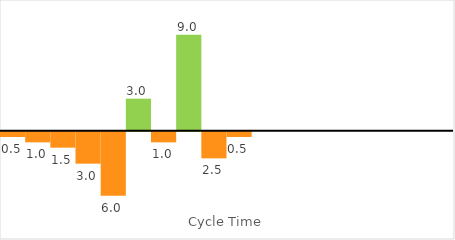
| Category | Activity |
|---|---|
| 1.0 | -0.5 |
| 2.0 | -1 |
| 3.0 | -1.5 |
| 4.0 | -3 |
| 5.0 | -6 |
| 6.0 | 3 |
| 7.0 | -1 |
| 8.0 | 9 |
| 9.0 | -2.5 |
| 10.0 | -0.5 |
| 11.0 | 0 |
| 12.0 | 0 |
| 13.0 | 0 |
| 14.0 | 0 |
| 15.0 | 0 |
| 16.0 | 0 |
| 17.0 | 0 |
| 18.0 | 0 |